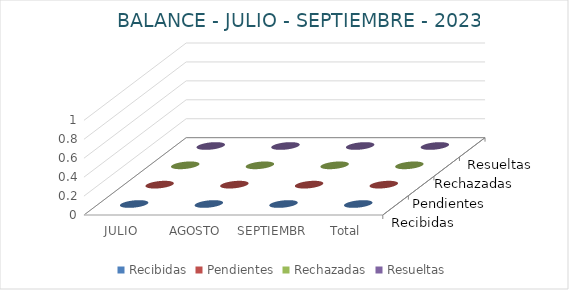
| Category | Recibidas | Pendientes | Rechazadas | Resueltas |
|---|---|---|---|---|
| JULIO | 0 | 0 | 0 | 0 |
| AGOSTO | 0 | 0 | 0 | 0 |
| SEPTIEMBRE | 0 | 0 | 0 | 0 |
| Total general | 0 | 0 | 0 | 0 |